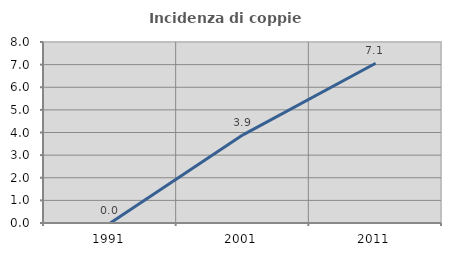
| Category | Incidenza di coppie miste |
|---|---|
| 1991.0 | 0 |
| 2001.0 | 3.896 |
| 2011.0 | 7.059 |